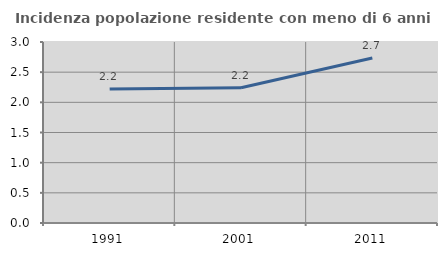
| Category | Incidenza popolazione residente con meno di 6 anni |
|---|---|
| 1991.0 | 2.222 |
| 2001.0 | 2.241 |
| 2011.0 | 2.736 |